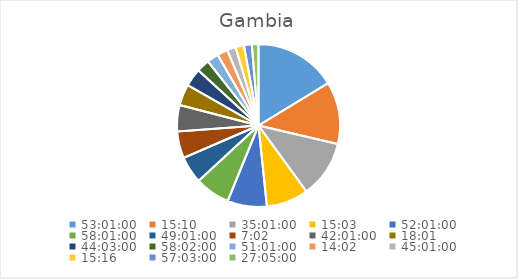
| Category | Series 0 |
|---|---|
| 2.2090277777777776 | 17.202 |
| 0.6319444444444444 | 13.053 |
| 1.4590277777777778 | 11.973 |
| 0.6270833333333333 | 8.812 |
| 2.167361111111111 | 8.245 |
| 2.417361111111111 | 7.34 |
| 2.042361111111111 | 5.68 |
| 0.29305555555555557 | 5.618 |
| 1.7506944444444443 | 5.514 |
| 0.7506944444444444 | 4.432 |
| 1.8354166666666665 | 3.769 |
| 2.4180555555555556 | 2.703 |
| 2.1256944444444446 | 2.41 |
| 0.5847222222222223 | 2.216 |
| 1.8756944444444443 | 1.811 |
| 0.6361111111111112 | 1.754 |
| 2.377083333333333 | 1.639 |
| 1.128472222222222 | 1.39 |